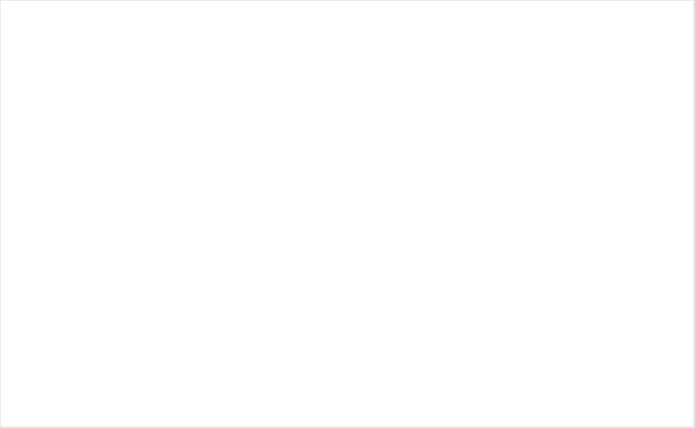
| Category | Bezoekers | Paginaweergaven |
|---|---|---|
| 2008 | 422907 | 1589264 |
| 2009 | 714762 | 2709751 |
| 2010 | 685924 | 2551883 |
| 2011 | 936871 | 3169977 |
| 2012 | 1359053 | 4756335 |
| 2013 | 1805787 | 6696678 |
| 2014 | 2112336 | 7689590 |
| 2015 | 2289208 | 7595982 |
| 2016 | 2458672 | 7736712 |
| 2017 | 2317181 | 6795601 |
| 2018 | 2641347 | 9072217 |
| 2019 | 3821683 | 14063974 |
| 2020 | 6631803 | 16596296 |
| 2021 | 5702096 | 16488986 |
| 2022 | 6241376 | 17649465 |